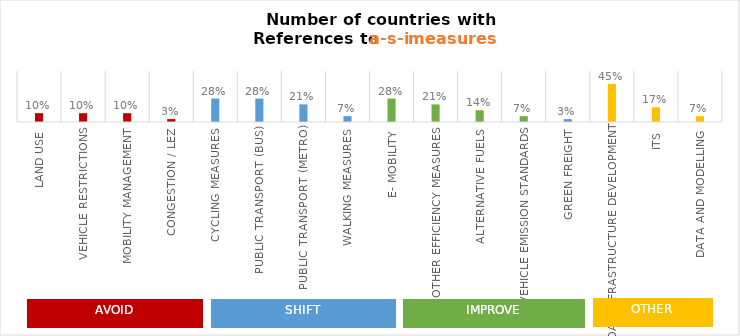
| Category | Series 0 |
|---|---|
| Land Use | 0.103 |
| Vehicle Restrictions | 0.103 |
| Mobility Management | 0.103 |
| Congestion / LEZ | 0.034 |
| Cycling Measures | 0.276 |
| Public Transport (Bus) | 0.276 |
| Public Transport (Metro) | 0.207 |
| Walking Measures | 0.069 |
| E- mobility | 0.276 |
| Other Efficiency Measures | 0.207 |
| Alternative Fuels | 0.138 |
| Vehicle Emission Standards | 0.069 |
| Green Freight | 0.034 |
| Road Infrastructure Development | 0.448 |
| ITS | 0.172 |
| Data and Modelling | 0.069 |